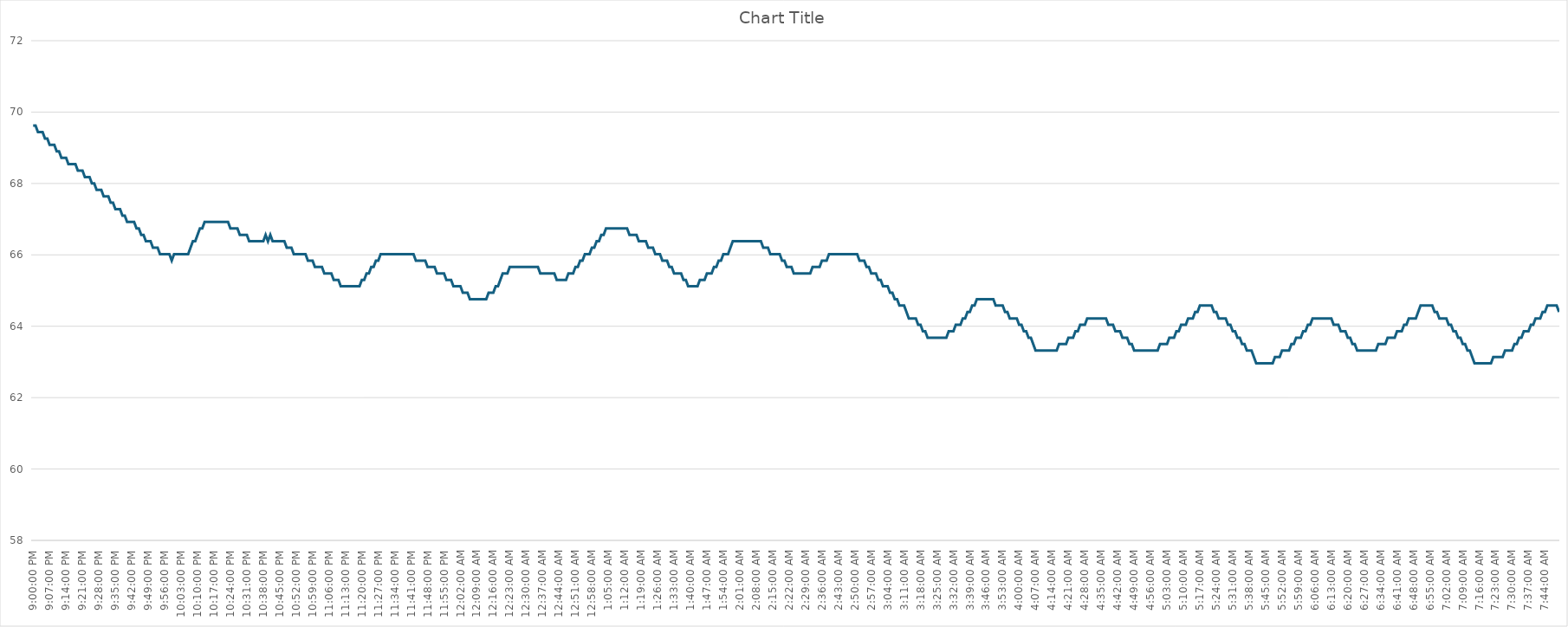
| Category | Series 0 |
|---|---|
| 2024-03-15 21:00:00 | 69.62 |
| 2024-03-15 21:01:00 | 69.62 |
| 2024-03-15 21:02:00 | 69.44 |
| 2024-03-15 21:03:00 | 69.44 |
| 2024-03-15 21:04:00 | 69.44 |
| 2024-03-15 21:05:00 | 69.26 |
| 2024-03-15 21:06:00 | 69.26 |
| 2024-03-15 21:07:00 | 69.08 |
| 2024-03-15 21:08:00 | 69.08 |
| 2024-03-15 21:09:00 | 69.08 |
| 2024-03-15 21:10:00 | 68.9 |
| 2024-03-15 21:11:00 | 68.9 |
| 2024-03-15 21:12:00 | 68.72 |
| 2024-03-15 21:13:00 | 68.72 |
| 2024-03-15 21:14:00 | 68.72 |
| 2024-03-15 21:15:00 | 68.54 |
| 2024-03-15 21:16:00 | 68.54 |
| 2024-03-15 21:17:00 | 68.54 |
| 2024-03-15 21:18:00 | 68.54 |
| 2024-03-15 21:19:00 | 68.36 |
| 2024-03-15 21:20:00 | 68.36 |
| 2024-03-15 21:21:00 | 68.36 |
| 2024-03-15 21:22:00 | 68.18 |
| 2024-03-15 21:23:00 | 68.18 |
| 2024-03-15 21:24:00 | 68.18 |
| 2024-03-15 21:25:00 | 68 |
| 2024-03-15 21:26:00 | 68 |
| 2024-03-15 21:27:00 | 67.82 |
| 2024-03-15 21:28:00 | 67.82 |
| 2024-03-15 21:29:00 | 67.82 |
| 2024-03-15 21:30:00 | 67.64 |
| 2024-03-15 21:31:00 | 67.64 |
| 2024-03-15 21:32:00 | 67.64 |
| 2024-03-15 21:33:00 | 67.46 |
| 2024-03-15 21:34:00 | 67.46 |
| 2024-03-15 21:35:00 | 67.28 |
| 2024-03-15 21:36:00 | 67.28 |
| 2024-03-15 21:37:00 | 67.28 |
| 2024-03-15 21:38:00 | 67.1 |
| 2024-03-15 21:39:00 | 67.1 |
| 2024-03-15 21:40:00 | 66.92 |
| 2024-03-15 21:41:00 | 66.92 |
| 2024-03-15 21:42:00 | 66.92 |
| 2024-03-15 21:43:00 | 66.92 |
| 2024-03-15 21:44:00 | 66.74 |
| 2024-03-15 21:45:00 | 66.74 |
| 2024-03-15 21:46:00 | 66.56 |
| 2024-03-15 21:47:00 | 66.56 |
| 2024-03-15 21:48:00 | 66.38 |
| 2024-03-15 21:49:00 | 66.38 |
| 2024-03-15 21:50:00 | 66.38 |
| 2024-03-15 21:51:00 | 66.2 |
| 2024-03-15 21:52:00 | 66.2 |
| 2024-03-15 21:53:00 | 66.2 |
| 2024-03-15 21:54:00 | 66.02 |
| 2024-03-15 21:55:00 | 66.02 |
| 2024-03-15 21:56:00 | 66.02 |
| 2024-03-15 21:57:00 | 66.02 |
| 2024-03-15 21:58:00 | 66.02 |
| 2024-03-15 21:59:00 | 65.84 |
| 2024-03-15 22:00:00 | 66.02 |
| 2024-03-15 22:01:00 | 66.02 |
| 2024-03-15 22:02:00 | 66.02 |
| 2024-03-15 22:03:00 | 66.02 |
| 2024-03-15 22:04:00 | 66.02 |
| 2024-03-15 22:05:00 | 66.02 |
| 2024-03-15 22:06:00 | 66.02 |
| 2024-03-15 22:07:00 | 66.2 |
| 2024-03-15 22:08:00 | 66.38 |
| 2024-03-15 22:09:00 | 66.38 |
| 2024-03-15 22:10:00 | 66.56 |
| 2024-03-15 22:11:00 | 66.74 |
| 2024-03-15 22:12:00 | 66.74 |
| 2024-03-15 22:13:00 | 66.92 |
| 2024-03-15 22:14:00 | 66.92 |
| 2024-03-15 22:15:00 | 66.92 |
| 2024-03-15 22:16:00 | 66.92 |
| 2024-03-15 22:17:00 | 66.92 |
| 2024-03-15 22:18:00 | 66.92 |
| 2024-03-15 22:19:00 | 66.92 |
| 2024-03-15 22:20:00 | 66.92 |
| 2024-03-15 22:21:00 | 66.92 |
| 2024-03-15 22:22:00 | 66.92 |
| 2024-03-15 22:23:00 | 66.92 |
| 2024-03-15 22:24:00 | 66.74 |
| 2024-03-15 22:25:00 | 66.74 |
| 2024-03-15 22:26:00 | 66.74 |
| 2024-03-15 22:27:00 | 66.74 |
| 2024-03-15 22:28:00 | 66.56 |
| 2024-03-15 22:29:00 | 66.56 |
| 2024-03-15 22:30:00 | 66.56 |
| 2024-03-15 22:31:00 | 66.56 |
| 2024-03-15 22:32:00 | 66.38 |
| 2024-03-15 22:33:00 | 66.38 |
| 2024-03-15 22:34:00 | 66.38 |
| 2024-03-15 22:35:00 | 66.38 |
| 2024-03-15 22:36:00 | 66.38 |
| 2024-03-15 22:37:00 | 66.38 |
| 2024-03-15 22:38:00 | 66.38 |
| 2024-03-15 22:39:00 | 66.56 |
| 2024-03-15 22:40:00 | 66.38 |
| 2024-03-15 22:41:00 | 66.56 |
| 2024-03-15 22:42:00 | 66.38 |
| 2024-03-15 22:43:00 | 66.38 |
| 2024-03-15 22:44:00 | 66.38 |
| 2024-03-15 22:45:00 | 66.38 |
| 2024-03-15 22:46:00 | 66.38 |
| 2024-03-15 22:47:00 | 66.38 |
| 2024-03-15 22:48:00 | 66.2 |
| 2024-03-15 22:49:00 | 66.2 |
| 2024-03-15 22:50:00 | 66.2 |
| 2024-03-15 22:51:00 | 66.02 |
| 2024-03-15 22:52:00 | 66.02 |
| 2024-03-15 22:53:00 | 66.02 |
| 2024-03-15 22:54:00 | 66.02 |
| 2024-03-15 22:55:00 | 66.02 |
| 2024-03-15 22:56:00 | 66.02 |
| 2024-03-15 22:57:00 | 65.84 |
| 2024-03-15 22:58:00 | 65.84 |
| 2024-03-15 22:59:00 | 65.84 |
| 2024-03-15 23:00:00 | 65.66 |
| 2024-03-15 23:01:00 | 65.66 |
| 2024-03-15 23:02:00 | 65.66 |
| 2024-03-15 23:03:00 | 65.66 |
| 2024-03-15 23:04:00 | 65.48 |
| 2024-03-15 23:05:00 | 65.48 |
| 2024-03-15 23:06:00 | 65.48 |
| 2024-03-15 23:07:00 | 65.48 |
| 2024-03-15 23:08:00 | 65.3 |
| 2024-03-15 23:09:00 | 65.3 |
| 2024-03-15 23:10:00 | 65.3 |
| 2024-03-15 23:11:00 | 65.12 |
| 2024-03-15 23:12:00 | 65.12 |
| 2024-03-15 23:13:00 | 65.12 |
| 2024-03-15 23:14:00 | 65.12 |
| 2024-03-15 23:15:00 | 65.12 |
| 2024-03-15 23:16:00 | 65.12 |
| 2024-03-15 23:17:00 | 65.12 |
| 2024-03-15 23:18:00 | 65.12 |
| 2024-03-15 23:19:00 | 65.12 |
| 2024-03-15 23:20:00 | 65.3 |
| 2024-03-15 23:21:00 | 65.3 |
| 2024-03-15 23:22:00 | 65.48 |
| 2024-03-15 23:23:00 | 65.48 |
| 2024-03-15 23:24:00 | 65.66 |
| 2024-03-15 23:25:00 | 65.66 |
| 2024-03-15 23:26:00 | 65.84 |
| 2024-03-15 23:27:00 | 65.84 |
| 2024-03-15 23:28:00 | 66.02 |
| 2024-03-15 23:29:00 | 66.02 |
| 2024-03-15 23:30:00 | 66.02 |
| 2024-03-15 23:31:00 | 66.02 |
| 2024-03-15 23:32:00 | 66.02 |
| 2024-03-15 23:33:00 | 66.02 |
| 2024-03-15 23:34:00 | 66.02 |
| 2024-03-15 23:35:00 | 66.02 |
| 2024-03-15 23:36:00 | 66.02 |
| 2024-03-15 23:37:00 | 66.02 |
| 2024-03-15 23:38:00 | 66.02 |
| 2024-03-15 23:39:00 | 66.02 |
| 2024-03-15 23:40:00 | 66.02 |
| 2024-03-15 23:41:00 | 66.02 |
| 2024-03-15 23:42:00 | 66.02 |
| 2024-03-15 23:43:00 | 65.84 |
| 2024-03-15 23:44:00 | 65.84 |
| 2024-03-15 23:45:00 | 65.84 |
| 2024-03-15 23:46:00 | 65.84 |
| 2024-03-15 23:47:00 | 65.84 |
| 2024-03-15 23:48:00 | 65.66 |
| 2024-03-15 23:49:00 | 65.66 |
| 2024-03-15 23:50:00 | 65.66 |
| 2024-03-15 23:51:00 | 65.66 |
| 2024-03-15 23:52:00 | 65.48 |
| 2024-03-15 23:53:00 | 65.48 |
| 2024-03-15 23:54:00 | 65.48 |
| 2024-03-15 23:55:00 | 65.48 |
| 2024-03-15 23:56:00 | 65.3 |
| 2024-03-15 23:57:00 | 65.3 |
| 2024-03-15 23:58:00 | 65.3 |
| 2024-03-15 23:59:00 | 65.12 |
| 2024-03-16 | 65.12 |
| 2024-03-16 00:01:00 | 65.12 |
| 2024-03-16 00:02:00 | 65.12 |
| 2024-03-16 00:03:00 | 64.94 |
| 2024-03-16 00:04:00 | 64.94 |
| 2024-03-16 00:05:00 | 64.94 |
| 2024-03-16 00:06:00 | 64.76 |
| 2024-03-16 00:07:00 | 64.76 |
| 2024-03-16 00:08:00 | 64.76 |
| 2024-03-16 00:09:00 | 64.76 |
| 2024-03-16 00:10:00 | 64.76 |
| 2024-03-16 00:11:00 | 64.76 |
| 2024-03-16 00:12:00 | 64.76 |
| 2024-03-16 00:13:00 | 64.76 |
| 2024-03-16 00:14:00 | 64.94 |
| 2024-03-16 00:15:00 | 64.94 |
| 2024-03-16 00:16:00 | 64.94 |
| 2024-03-16 00:17:00 | 65.12 |
| 2024-03-16 00:18:00 | 65.12 |
| 2024-03-16 00:19:00 | 65.3 |
| 2024-03-16 00:20:00 | 65.48 |
| 2024-03-16 00:21:00 | 65.48 |
| 2024-03-16 00:22:00 | 65.48 |
| 2024-03-16 00:23:00 | 65.66 |
| 2024-03-16 00:24:00 | 65.66 |
| 2024-03-16 00:25:00 | 65.66 |
| 2024-03-16 00:26:00 | 65.66 |
| 2024-03-16 00:27:00 | 65.66 |
| 2024-03-16 00:28:00 | 65.66 |
| 2024-03-16 00:29:00 | 65.66 |
| 2024-03-16 00:30:00 | 65.66 |
| 2024-03-16 00:31:00 | 65.66 |
| 2024-03-16 00:32:00 | 65.66 |
| 2024-03-16 00:33:00 | 65.66 |
| 2024-03-16 00:34:00 | 65.66 |
| 2024-03-16 00:35:00 | 65.66 |
| 2024-03-16 00:36:00 | 65.48 |
| 2024-03-16 00:37:00 | 65.48 |
| 2024-03-16 00:38:00 | 65.48 |
| 2024-03-16 00:39:00 | 65.48 |
| 2024-03-16 00:40:00 | 65.48 |
| 2024-03-16 00:41:00 | 65.48 |
| 2024-03-16 00:42:00 | 65.48 |
| 2024-03-16 00:43:00 | 65.3 |
| 2024-03-16 00:44:00 | 65.3 |
| 2024-03-16 00:45:00 | 65.3 |
| 2024-03-16 00:46:00 | 65.3 |
| 2024-03-16 00:47:00 | 65.3 |
| 2024-03-16 00:48:00 | 65.48 |
| 2024-03-16 00:49:00 | 65.48 |
| 2024-03-16 00:50:00 | 65.48 |
| 2024-03-16 00:51:00 | 65.66 |
| 2024-03-16 00:52:00 | 65.66 |
| 2024-03-16 00:53:00 | 65.84 |
| 2024-03-16 00:54:00 | 65.84 |
| 2024-03-16 00:55:00 | 66.02 |
| 2024-03-16 00:56:00 | 66.02 |
| 2024-03-16 00:57:00 | 66.02 |
| 2024-03-16 00:58:00 | 66.2 |
| 2024-03-16 00:59:00 | 66.2 |
| 2024-03-16 01:00:00 | 66.38 |
| 2024-03-16 01:01:00 | 66.38 |
| 2024-03-16 01:02:00 | 66.56 |
| 2024-03-16 01:03:00 | 66.56 |
| 2024-03-16 01:04:00 | 66.74 |
| 2024-03-16 01:05:00 | 66.74 |
| 2024-03-16 01:06:00 | 66.74 |
| 2024-03-16 01:07:00 | 66.74 |
| 2024-03-16 01:08:00 | 66.74 |
| 2024-03-16 01:09:00 | 66.74 |
| 2024-03-16 01:10:00 | 66.74 |
| 2024-03-16 01:11:00 | 66.74 |
| 2024-03-16 01:12:00 | 66.74 |
| 2024-03-16 01:13:00 | 66.74 |
| 2024-03-16 01:14:00 | 66.56 |
| 2024-03-16 01:15:00 | 66.56 |
| 2024-03-16 01:16:00 | 66.56 |
| 2024-03-16 01:17:00 | 66.56 |
| 2024-03-16 01:18:00 | 66.38 |
| 2024-03-16 01:19:00 | 66.38 |
| 2024-03-16 01:20:00 | 66.38 |
| 2024-03-16 01:21:00 | 66.38 |
| 2024-03-16 01:22:00 | 66.2 |
| 2024-03-16 01:23:00 | 66.2 |
| 2024-03-16 01:24:00 | 66.2 |
| 2024-03-16 01:25:00 | 66.02 |
| 2024-03-16 01:26:00 | 66.02 |
| 2024-03-16 01:27:00 | 66.02 |
| 2024-03-16 01:28:00 | 65.84 |
| 2024-03-16 01:29:00 | 65.84 |
| 2024-03-16 01:30:00 | 65.84 |
| 2024-03-16 01:31:00 | 65.66 |
| 2024-03-16 01:32:00 | 65.66 |
| 2024-03-16 01:33:00 | 65.48 |
| 2024-03-16 01:34:00 | 65.48 |
| 2024-03-16 01:35:00 | 65.48 |
| 2024-03-16 01:36:00 | 65.48 |
| 2024-03-16 01:37:00 | 65.3 |
| 2024-03-16 01:38:00 | 65.3 |
| 2024-03-16 01:39:00 | 65.12 |
| 2024-03-16 01:40:00 | 65.12 |
| 2024-03-16 01:41:00 | 65.12 |
| 2024-03-16 01:42:00 | 65.12 |
| 2024-03-16 01:43:00 | 65.12 |
| 2024-03-16 01:44:00 | 65.3 |
| 2024-03-16 01:45:00 | 65.3 |
| 2024-03-16 01:46:00 | 65.3 |
| 2024-03-16 01:47:00 | 65.48 |
| 2024-03-16 01:48:00 | 65.48 |
| 2024-03-16 01:49:00 | 65.48 |
| 2024-03-16 01:50:00 | 65.66 |
| 2024-03-16 01:51:00 | 65.66 |
| 2024-03-16 01:52:00 | 65.84 |
| 2024-03-16 01:53:00 | 65.84 |
| 2024-03-16 01:54:00 | 66.02 |
| 2024-03-16 01:55:00 | 66.02 |
| 2024-03-16 01:56:00 | 66.02 |
| 2024-03-16 01:57:00 | 66.2 |
| 2024-03-16 01:58:00 | 66.38 |
| 2024-03-16 01:59:00 | 66.38 |
| 2024-03-16 02:00:00 | 66.38 |
| 2024-03-16 02:01:00 | 66.38 |
| 2024-03-16 02:02:00 | 66.38 |
| 2024-03-16 02:03:00 | 66.38 |
| 2024-03-16 02:04:00 | 66.38 |
| 2024-03-16 02:05:00 | 66.38 |
| 2024-03-16 02:06:00 | 66.38 |
| 2024-03-16 02:07:00 | 66.38 |
| 2024-03-16 02:08:00 | 66.38 |
| 2024-03-16 02:09:00 | 66.38 |
| 2024-03-16 02:10:00 | 66.38 |
| 2024-03-16 02:11:00 | 66.2 |
| 2024-03-16 02:12:00 | 66.2 |
| 2024-03-16 02:13:00 | 66.2 |
| 2024-03-16 02:14:00 | 66.02 |
| 2024-03-16 02:15:00 | 66.02 |
| 2024-03-16 02:16:00 | 66.02 |
| 2024-03-16 02:17:00 | 66.02 |
| 2024-03-16 02:18:00 | 66.02 |
| 2024-03-16 02:19:00 | 65.84 |
| 2024-03-16 02:20:00 | 65.84 |
| 2024-03-16 02:21:00 | 65.66 |
| 2024-03-16 02:22:00 | 65.66 |
| 2024-03-16 02:23:00 | 65.66 |
| 2024-03-16 02:24:00 | 65.48 |
| 2024-03-16 02:25:00 | 65.48 |
| 2024-03-16 02:26:00 | 65.48 |
| 2024-03-16 02:27:00 | 65.48 |
| 2024-03-16 02:28:00 | 65.48 |
| 2024-03-16 02:29:00 | 65.48 |
| 2024-03-16 02:30:00 | 65.48 |
| 2024-03-16 02:31:00 | 65.48 |
| 2024-03-16 02:32:00 | 65.66 |
| 2024-03-16 02:33:00 | 65.66 |
| 2024-03-16 02:34:00 | 65.66 |
| 2024-03-16 02:35:00 | 65.66 |
| 2024-03-16 02:36:00 | 65.84 |
| 2024-03-16 02:37:00 | 65.84 |
| 2024-03-16 02:38:00 | 65.84 |
| 2024-03-16 02:39:00 | 66.02 |
| 2024-03-16 02:40:00 | 66.02 |
| 2024-03-16 02:41:00 | 66.02 |
| 2024-03-16 02:42:00 | 66.02 |
| 2024-03-16 02:43:00 | 66.02 |
| 2024-03-16 02:44:00 | 66.02 |
| 2024-03-16 02:45:00 | 66.02 |
| 2024-03-16 02:46:00 | 66.02 |
| 2024-03-16 02:47:00 | 66.02 |
| 2024-03-16 02:48:00 | 66.02 |
| 2024-03-16 02:49:00 | 66.02 |
| 2024-03-16 02:50:00 | 66.02 |
| 2024-03-16 02:51:00 | 66.02 |
| 2024-03-16 02:52:00 | 65.84 |
| 2024-03-16 02:53:00 | 65.84 |
| 2024-03-16 02:54:00 | 65.84 |
| 2024-03-16 02:55:00 | 65.66 |
| 2024-03-16 02:56:00 | 65.66 |
| 2024-03-16 02:57:00 | 65.48 |
| 2024-03-16 02:58:00 | 65.48 |
| 2024-03-16 02:59:00 | 65.48 |
| 2024-03-16 03:00:00 | 65.3 |
| 2024-03-16 03:01:00 | 65.3 |
| 2024-03-16 03:02:00 | 65.12 |
| 2024-03-16 03:03:00 | 65.12 |
| 2024-03-16 03:04:00 | 65.12 |
| 2024-03-16 03:05:00 | 64.94 |
| 2024-03-16 03:06:00 | 64.94 |
| 2024-03-16 03:07:00 | 64.76 |
| 2024-03-16 03:08:00 | 64.76 |
| 2024-03-16 03:09:00 | 64.58 |
| 2024-03-16 03:10:00 | 64.58 |
| 2024-03-16 03:11:00 | 64.58 |
| 2024-03-16 03:12:00 | 64.4 |
| 2024-03-16 03:13:00 | 64.22 |
| 2024-03-16 03:14:00 | 64.22 |
| 2024-03-16 03:15:00 | 64.22 |
| 2024-03-16 03:16:00 | 64.22 |
| 2024-03-16 03:17:00 | 64.04 |
| 2024-03-16 03:18:00 | 64.04 |
| 2024-03-16 03:19:00 | 63.86 |
| 2024-03-16 03:20:00 | 63.86 |
| 2024-03-16 03:21:00 | 63.68 |
| 2024-03-16 03:22:00 | 63.68 |
| 2024-03-16 03:23:00 | 63.68 |
| 2024-03-16 03:24:00 | 63.68 |
| 2024-03-16 03:25:00 | 63.68 |
| 2024-03-16 03:26:00 | 63.68 |
| 2024-03-16 03:27:00 | 63.68 |
| 2024-03-16 03:28:00 | 63.68 |
| 2024-03-16 03:29:00 | 63.68 |
| 2024-03-16 03:30:00 | 63.86 |
| 2024-03-16 03:31:00 | 63.86 |
| 2024-03-16 03:32:00 | 63.86 |
| 2024-03-16 03:33:00 | 64.04 |
| 2024-03-16 03:34:00 | 64.04 |
| 2024-03-16 03:35:00 | 64.04 |
| 2024-03-16 03:36:00 | 64.22 |
| 2024-03-16 03:37:00 | 64.22 |
| 2024-03-16 03:38:00 | 64.4 |
| 2024-03-16 03:39:00 | 64.4 |
| 2024-03-16 03:40:00 | 64.58 |
| 2024-03-16 03:41:00 | 64.58 |
| 2024-03-16 03:42:00 | 64.76 |
| 2024-03-16 03:43:00 | 64.76 |
| 2024-03-16 03:44:00 | 64.76 |
| 2024-03-16 03:45:00 | 64.76 |
| 2024-03-16 03:46:00 | 64.76 |
| 2024-03-16 03:47:00 | 64.76 |
| 2024-03-16 03:48:00 | 64.76 |
| 2024-03-16 03:49:00 | 64.76 |
| 2024-03-16 03:50:00 | 64.58 |
| 2024-03-16 03:51:00 | 64.58 |
| 2024-03-16 03:52:00 | 64.58 |
| 2024-03-16 03:53:00 | 64.58 |
| 2024-03-16 03:54:00 | 64.4 |
| 2024-03-16 03:55:00 | 64.4 |
| 2024-03-16 03:56:00 | 64.22 |
| 2024-03-16 03:57:00 | 64.22 |
| 2024-03-16 03:58:00 | 64.22 |
| 2024-03-16 03:59:00 | 64.22 |
| 2024-03-16 04:00:00 | 64.04 |
| 2024-03-16 04:01:00 | 64.04 |
| 2024-03-16 04:02:00 | 63.86 |
| 2024-03-16 04:03:00 | 63.86 |
| 2024-03-16 04:04:00 | 63.68 |
| 2024-03-16 04:05:00 | 63.68 |
| 2024-03-16 04:06:00 | 63.5 |
| 2024-03-16 04:07:00 | 63.32 |
| 2024-03-16 04:08:00 | 63.32 |
| 2024-03-16 04:09:00 | 63.32 |
| 2024-03-16 04:10:00 | 63.32 |
| 2024-03-16 04:11:00 | 63.32 |
| 2024-03-16 04:12:00 | 63.32 |
| 2024-03-16 04:13:00 | 63.32 |
| 2024-03-16 04:14:00 | 63.32 |
| 2024-03-16 04:15:00 | 63.32 |
| 2024-03-16 04:16:00 | 63.32 |
| 2024-03-16 04:17:00 | 63.5 |
| 2024-03-16 04:18:00 | 63.5 |
| 2024-03-16 04:19:00 | 63.5 |
| 2024-03-16 04:20:00 | 63.5 |
| 2024-03-16 04:21:00 | 63.68 |
| 2024-03-16 04:22:00 | 63.68 |
| 2024-03-16 04:23:00 | 63.68 |
| 2024-03-16 04:24:00 | 63.86 |
| 2024-03-16 04:25:00 | 63.86 |
| 2024-03-16 04:26:00 | 64.04 |
| 2024-03-16 04:27:00 | 64.04 |
| 2024-03-16 04:28:00 | 64.04 |
| 2024-03-16 04:29:00 | 64.22 |
| 2024-03-16 04:30:00 | 64.22 |
| 2024-03-16 04:31:00 | 64.22 |
| 2024-03-16 04:32:00 | 64.22 |
| 2024-03-16 04:33:00 | 64.22 |
| 2024-03-16 04:34:00 | 64.22 |
| 2024-03-16 04:35:00 | 64.22 |
| 2024-03-16 04:36:00 | 64.22 |
| 2024-03-16 04:37:00 | 64.22 |
| 2024-03-16 04:38:00 | 64.04 |
| 2024-03-16 04:39:00 | 64.04 |
| 2024-03-16 04:40:00 | 64.04 |
| 2024-03-16 04:41:00 | 63.86 |
| 2024-03-16 04:42:00 | 63.86 |
| 2024-03-16 04:43:00 | 63.86 |
| 2024-03-16 04:44:00 | 63.68 |
| 2024-03-16 04:45:00 | 63.68 |
| 2024-03-16 04:46:00 | 63.68 |
| 2024-03-16 04:47:00 | 63.5 |
| 2024-03-16 04:48:00 | 63.5 |
| 2024-03-16 04:49:00 | 63.32 |
| 2024-03-16 04:50:00 | 63.32 |
| 2024-03-16 04:51:00 | 63.32 |
| 2024-03-16 04:52:00 | 63.32 |
| 2024-03-16 04:53:00 | 63.32 |
| 2024-03-16 04:54:00 | 63.32 |
| 2024-03-16 04:55:00 | 63.32 |
| 2024-03-16 04:56:00 | 63.32 |
| 2024-03-16 04:57:00 | 63.32 |
| 2024-03-16 04:58:00 | 63.32 |
| 2024-03-16 04:59:00 | 63.32 |
| 2024-03-16 05:00:00 | 63.5 |
| 2024-03-16 05:01:00 | 63.5 |
| 2024-03-16 05:02:00 | 63.5 |
| 2024-03-16 05:03:00 | 63.5 |
| 2024-03-16 05:04:00 | 63.68 |
| 2024-03-16 05:05:00 | 63.68 |
| 2024-03-16 05:06:00 | 63.68 |
| 2024-03-16 05:07:00 | 63.86 |
| 2024-03-16 05:08:00 | 63.86 |
| 2024-03-16 05:09:00 | 64.04 |
| 2024-03-16 05:10:00 | 64.04 |
| 2024-03-16 05:11:00 | 64.04 |
| 2024-03-16 05:12:00 | 64.22 |
| 2024-03-16 05:13:00 | 64.22 |
| 2024-03-16 05:14:00 | 64.22 |
| 2024-03-16 05:15:00 | 64.4 |
| 2024-03-16 05:16:00 | 64.4 |
| 2024-03-16 05:17:00 | 64.58 |
| 2024-03-16 05:18:00 | 64.58 |
| 2024-03-16 05:19:00 | 64.58 |
| 2024-03-16 05:20:00 | 64.58 |
| 2024-03-16 05:21:00 | 64.58 |
| 2024-03-16 05:22:00 | 64.58 |
| 2024-03-16 05:23:00 | 64.4 |
| 2024-03-16 05:24:00 | 64.4 |
| 2024-03-16 05:25:00 | 64.22 |
| 2024-03-16 05:26:00 | 64.22 |
| 2024-03-16 05:27:00 | 64.22 |
| 2024-03-16 05:28:00 | 64.22 |
| 2024-03-16 05:29:00 | 64.04 |
| 2024-03-16 05:30:00 | 64.04 |
| 2024-03-16 05:31:00 | 63.86 |
| 2024-03-16 05:32:00 | 63.86 |
| 2024-03-16 05:33:00 | 63.68 |
| 2024-03-16 05:34:00 | 63.68 |
| 2024-03-16 05:35:00 | 63.5 |
| 2024-03-16 05:36:00 | 63.5 |
| 2024-03-16 05:37:00 | 63.32 |
| 2024-03-16 05:38:00 | 63.32 |
| 2024-03-16 05:39:00 | 63.32 |
| 2024-03-16 05:40:00 | 63.14 |
| 2024-03-16 05:41:00 | 62.96 |
| 2024-03-16 05:42:00 | 62.96 |
| 2024-03-16 05:43:00 | 62.96 |
| 2024-03-16 05:44:00 | 62.96 |
| 2024-03-16 05:45:00 | 62.96 |
| 2024-03-16 05:46:00 | 62.96 |
| 2024-03-16 05:47:00 | 62.96 |
| 2024-03-16 05:48:00 | 62.96 |
| 2024-03-16 05:49:00 | 63.14 |
| 2024-03-16 05:50:00 | 63.14 |
| 2024-03-16 05:51:00 | 63.14 |
| 2024-03-16 05:52:00 | 63.32 |
| 2024-03-16 05:53:00 | 63.32 |
| 2024-03-16 05:54:00 | 63.32 |
| 2024-03-16 05:55:00 | 63.32 |
| 2024-03-16 05:56:00 | 63.5 |
| 2024-03-16 05:57:00 | 63.5 |
| 2024-03-16 05:58:00 | 63.68 |
| 2024-03-16 05:59:00 | 63.68 |
| 2024-03-16 06:00:00 | 63.68 |
| 2024-03-16 06:01:00 | 63.86 |
| 2024-03-16 06:02:00 | 63.86 |
| 2024-03-16 06:03:00 | 64.04 |
| 2024-03-16 06:04:00 | 64.04 |
| 2024-03-16 06:05:00 | 64.22 |
| 2024-03-16 06:06:00 | 64.22 |
| 2024-03-16 06:07:00 | 64.22 |
| 2024-03-16 06:08:00 | 64.22 |
| 2024-03-16 06:09:00 | 64.22 |
| 2024-03-16 06:10:00 | 64.22 |
| 2024-03-16 06:11:00 | 64.22 |
| 2024-03-16 06:12:00 | 64.22 |
| 2024-03-16 06:13:00 | 64.22 |
| 2024-03-16 06:14:00 | 64.04 |
| 2024-03-16 06:15:00 | 64.04 |
| 2024-03-16 06:16:00 | 64.04 |
| 2024-03-16 06:17:00 | 63.86 |
| 2024-03-16 06:18:00 | 63.86 |
| 2024-03-16 06:19:00 | 63.86 |
| 2024-03-16 06:20:00 | 63.68 |
| 2024-03-16 06:21:00 | 63.68 |
| 2024-03-16 06:22:00 | 63.5 |
| 2024-03-16 06:23:00 | 63.5 |
| 2024-03-16 06:24:00 | 63.32 |
| 2024-03-16 06:25:00 | 63.32 |
| 2024-03-16 06:26:00 | 63.32 |
| 2024-03-16 06:27:00 | 63.32 |
| 2024-03-16 06:28:00 | 63.32 |
| 2024-03-16 06:29:00 | 63.32 |
| 2024-03-16 06:30:00 | 63.32 |
| 2024-03-16 06:31:00 | 63.32 |
| 2024-03-16 06:32:00 | 63.32 |
| 2024-03-16 06:33:00 | 63.5 |
| 2024-03-16 06:34:00 | 63.5 |
| 2024-03-16 06:35:00 | 63.5 |
| 2024-03-16 06:36:00 | 63.5 |
| 2024-03-16 06:37:00 | 63.68 |
| 2024-03-16 06:38:00 | 63.68 |
| 2024-03-16 06:39:00 | 63.68 |
| 2024-03-16 06:40:00 | 63.68 |
| 2024-03-16 06:41:00 | 63.86 |
| 2024-03-16 06:42:00 | 63.86 |
| 2024-03-16 06:43:00 | 63.86 |
| 2024-03-16 06:44:00 | 64.04 |
| 2024-03-16 06:45:00 | 64.04 |
| 2024-03-16 06:46:00 | 64.22 |
| 2024-03-16 06:47:00 | 64.22 |
| 2024-03-16 06:48:00 | 64.22 |
| 2024-03-16 06:49:00 | 64.22 |
| 2024-03-16 06:50:00 | 64.4 |
| 2024-03-16 06:51:00 | 64.58 |
| 2024-03-16 06:52:00 | 64.58 |
| 2024-03-16 06:53:00 | 64.58 |
| 2024-03-16 06:54:00 | 64.58 |
| 2024-03-16 06:55:00 | 64.58 |
| 2024-03-16 06:56:00 | 64.58 |
| 2024-03-16 06:57:00 | 64.4 |
| 2024-03-16 06:58:00 | 64.4 |
| 2024-03-16 06:59:00 | 64.22 |
| 2024-03-16 07:00:00 | 64.22 |
| 2024-03-16 07:01:00 | 64.22 |
| 2024-03-16 07:02:00 | 64.22 |
| 2024-03-16 07:03:00 | 64.04 |
| 2024-03-16 07:04:00 | 64.04 |
| 2024-03-16 07:05:00 | 63.86 |
| 2024-03-16 07:06:00 | 63.86 |
| 2024-03-16 07:07:00 | 63.68 |
| 2024-03-16 07:08:00 | 63.68 |
| 2024-03-16 07:09:00 | 63.5 |
| 2024-03-16 07:10:00 | 63.5 |
| 2024-03-16 07:11:00 | 63.32 |
| 2024-03-16 07:12:00 | 63.32 |
| 2024-03-16 07:13:00 | 63.14 |
| 2024-03-16 07:14:00 | 62.96 |
| 2024-03-16 07:15:00 | 62.96 |
| 2024-03-16 07:16:00 | 62.96 |
| 2024-03-16 07:17:00 | 62.96 |
| 2024-03-16 07:18:00 | 62.96 |
| 2024-03-16 07:19:00 | 62.96 |
| 2024-03-16 07:20:00 | 62.96 |
| 2024-03-16 07:21:00 | 62.96 |
| 2024-03-16 07:22:00 | 63.14 |
| 2024-03-16 07:23:00 | 63.14 |
| 2024-03-16 07:24:00 | 63.14 |
| 2024-03-16 07:25:00 | 63.14 |
| 2024-03-16 07:26:00 | 63.14 |
| 2024-03-16 07:27:00 | 63.32 |
| 2024-03-16 07:28:00 | 63.32 |
| 2024-03-16 07:29:00 | 63.32 |
| 2024-03-16 07:30:00 | 63.32 |
| 2024-03-16 07:31:00 | 63.5 |
| 2024-03-16 07:32:00 | 63.5 |
| 2024-03-16 07:33:00 | 63.68 |
| 2024-03-16 07:34:00 | 63.68 |
| 2024-03-16 07:35:00 | 63.86 |
| 2024-03-16 07:36:00 | 63.86 |
| 2024-03-16 07:37:00 | 63.86 |
| 2024-03-16 07:38:00 | 64.04 |
| 2024-03-16 07:39:00 | 64.04 |
| 2024-03-16 07:40:00 | 64.22 |
| 2024-03-16 07:41:00 | 64.22 |
| 2024-03-16 07:42:00 | 64.22 |
| 2024-03-16 07:43:00 | 64.4 |
| 2024-03-16 07:44:00 | 64.4 |
| 2024-03-16 07:45:00 | 64.58 |
| 2024-03-16 07:46:00 | 64.58 |
| 2024-03-16 07:47:00 | 64.58 |
| 2024-03-16 07:48:00 | 64.58 |
| 2024-03-16 07:49:00 | 64.58 |
| 2024-03-16 07:50:00 | 64.4 |